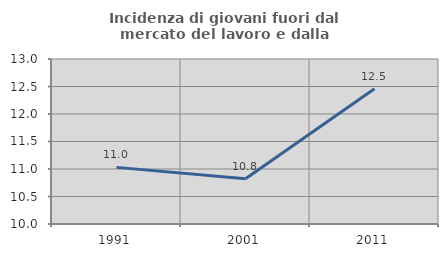
| Category | Incidenza di giovani fuori dal mercato del lavoro e dalla formazione  |
|---|---|
| 1991.0 | 11.03 |
| 2001.0 | 10.822 |
| 2011.0 | 12.459 |